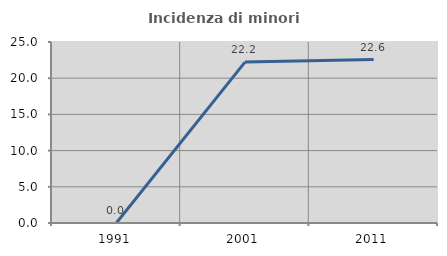
| Category | Incidenza di minori stranieri |
|---|---|
| 1991.0 | 0 |
| 2001.0 | 22.222 |
| 2011.0 | 22.581 |